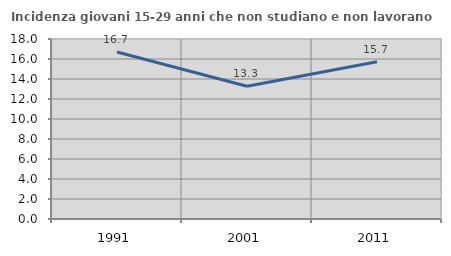
| Category | Incidenza giovani 15-29 anni che non studiano e non lavorano  |
|---|---|
| 1991.0 | 16.699 |
| 2001.0 | 13.282 |
| 2011.0 | 15.732 |